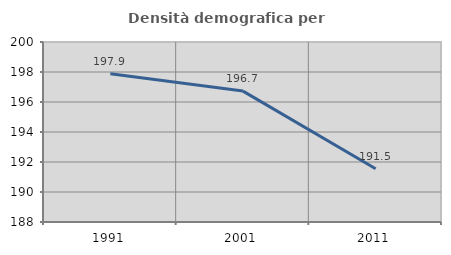
| Category | Densità demografica |
|---|---|
| 1991.0 | 197.883 |
| 2001.0 | 196.727 |
| 2011.0 | 191.547 |